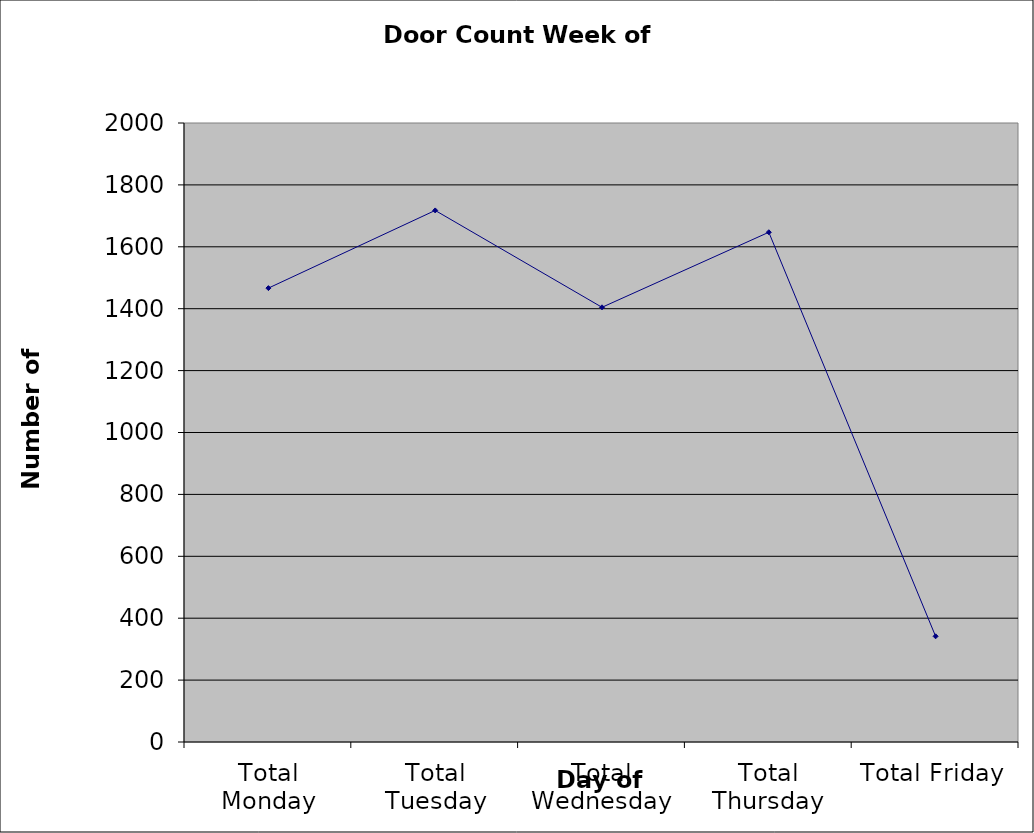
| Category | Series 0 |
|---|---|
| Total Monday | 1466.5 |
| Total Tuesday | 1717.5 |
| Total Wednesday | 1404.5 |
| Total Thursday | 1647 |
| Total Friday | 341.5 |